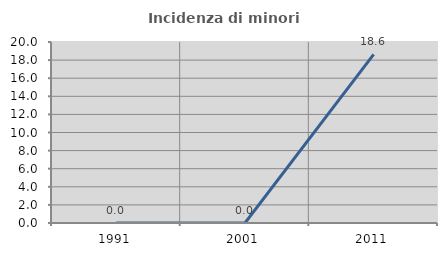
| Category | Incidenza di minori stranieri |
|---|---|
| 1991.0 | 0 |
| 2001.0 | 0 |
| 2011.0 | 18.627 |